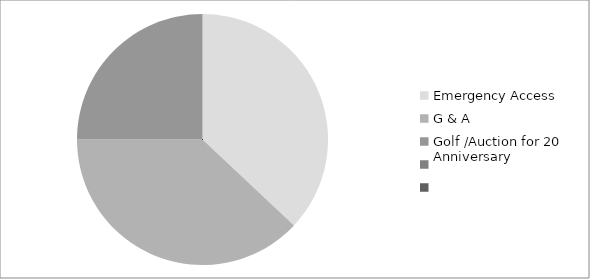
| Category | Series 0 |
|---|---|
| Emergency Access | 0.37 |
| G & A | 0.38 |
| Golf /Auction for 20 Anniversary | 0.25 |